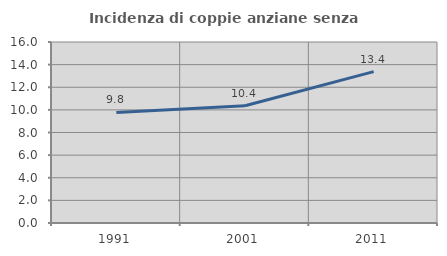
| Category | Incidenza di coppie anziane senza figli  |
|---|---|
| 1991.0 | 9.773 |
| 2001.0 | 10.36 |
| 2011.0 | 13.377 |